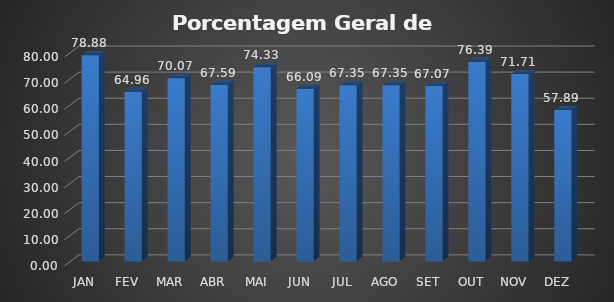
| Category | Porcentagem Geral de Ocupação |
|---|---|
|  JAN  | 78.876 |
|  FEV  | 64.965 |
|  MAR  | 70.07 |
|  ABR  | 67.588 |
|  MAI  | 74.333 |
|  JUN  | 66.089 |
|  JUL  | 67.354 |
|  AGO  | 67.354 |
|  SET  | 67.073 |
|  OUT  | 76.393 |
|  NOV  | 71.71 |
|  DEZ  | 57.892 |